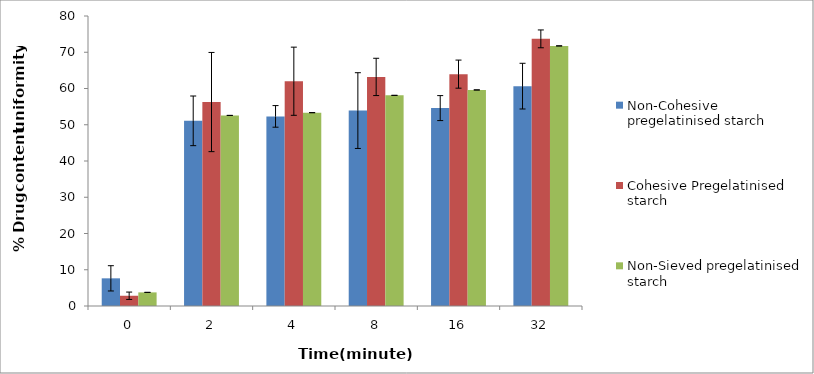
| Category | Non-Cohesive pregelatinised starch | Cohesive Pregelatinised starch | Non-Sieved pregelatinised starch |
|---|---|---|---|
| 0.0 | 7.632 | 2.826 | 3.756 |
| 2.0 | 51.08 | 56.263 | 52.577 |
| 4.0 | 52.305 | 62.007 | 53.334 |
| 8.0 | 53.907 | 63.194 | 58.105 |
| 16.0 | 54.593 | 63.962 | 59.6 |
| 32.0 | 60.65 | 73.693 | 71.753 |